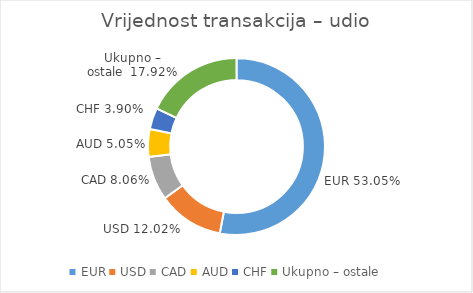
| Category | Vrijednost transakcija – udio |
|---|---|
| EUR | 0.53 |
| USD | 0.12 |
| CAD | 0.081 |
| AUD | 0.051 |
| CHF | 0.039 |
| Ukupno – ostale  | 0.179 |